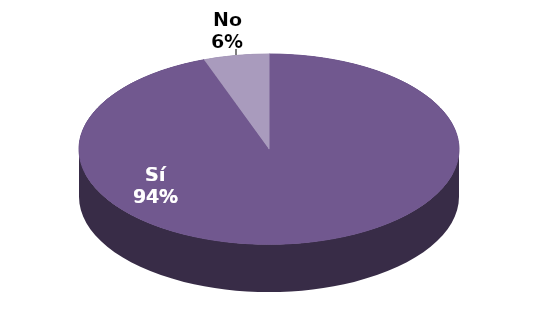
| Category | Series 1 |
|---|---|
| Sí | 17 |
| No | 1 |